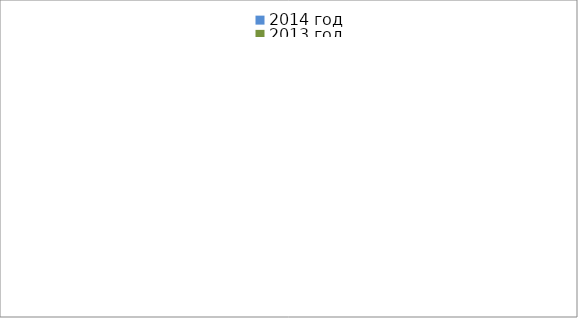
| Category | 2014 год | 2013 год |
|---|---|---|
|  - поджог | 17 | 31 |
|  - неосторожное обращение с огнём | 37 | 47 |
|  - НПТЭ электрооборудования | 17 | 21 |
|  - НПУ и Э печей | 56 | 40 |
|  - НПУ и Э транспортных средств | 49 | 51 |
|   -Шалость с огнем детей | 0 | 3 |
|  -НППБ при эксплуатации эл.приборов | 19 | 23 |
|  - курение | 17 | 11 |
| - прочие | 81 | 71 |
| - не установленные причины | 7 | 1 |